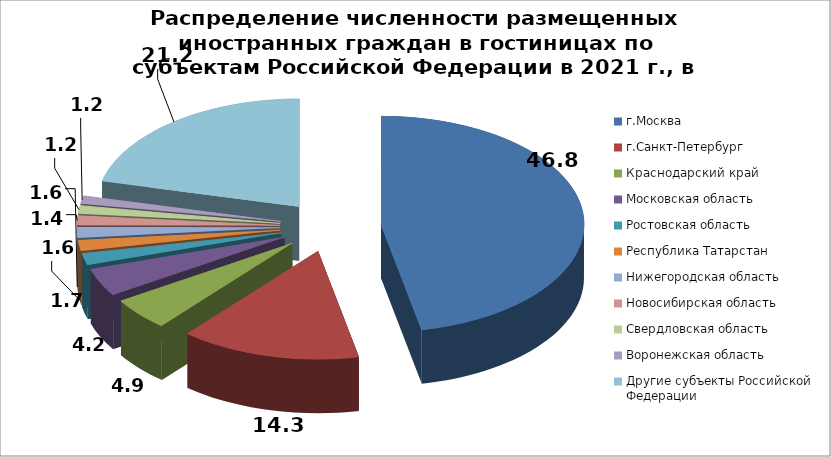
| Category | Series 0 |
|---|---|
| г.Москва | 46.784 |
| г.Санкт-Петербург | 14.338 |
| Краснодарский край | 4.892 |
| Московская область | 4.167 |
| Ростовская область | 1.736 |
| Республика Татарстан | 1.581 |
| Нижегородская область | 1.552 |
| Новосибирская область | 1.376 |
| Свердловская область | 1.215 |
| Воронежская область | 1.176 |
| Другие субъекты Российской Федерации | 21.184 |